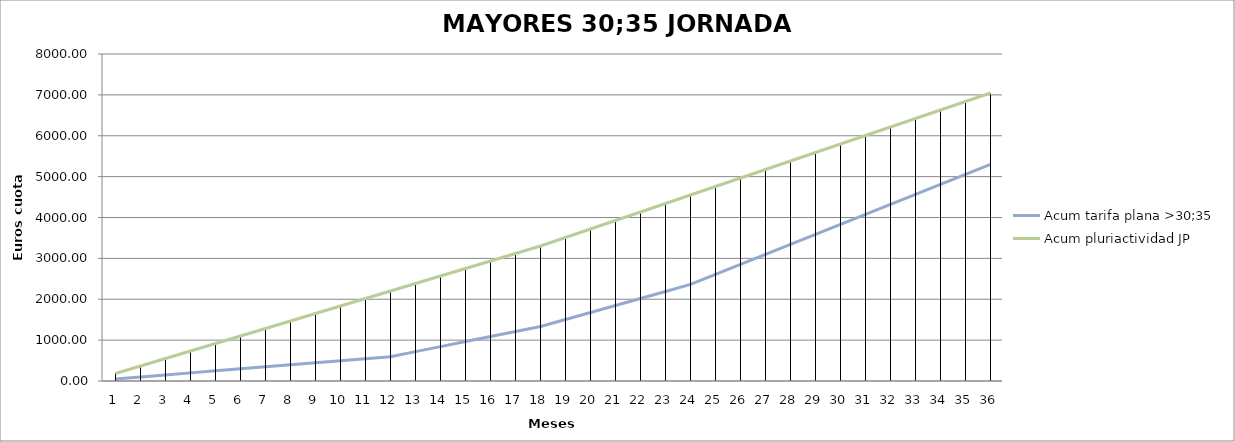
| Category | Acum tarifa plana >30;35 | Acum pluriactividad JP |
|---|---|---|
| 1.0 | 49.669 | 183.5 |
| 2.0 | 99.338 | 367 |
| 3.0 | 149.008 | 550.5 |
| 4.0 | 198.677 | 734 |
| 5.0 | 248.346 | 917.5 |
| 6.0 | 298.015 | 1101.001 |
| 7.0 | 347.684 | 1284.501 |
| 8.0 | 397.354 | 1468.001 |
| 9.0 | 447.023 | 1651.501 |
| 10.0 | 496.692 | 1835.001 |
| 11.0 | 546.361 | 2018.501 |
| 12.0 | 596.03 | 2202.001 |
| 13.0 | 718.824 | 2385.501 |
| 14.0 | 841.617 | 2569.001 |
| 15.0 | 964.41 | 2752.502 |
| 16.0 | 1087.204 | 2936.002 |
| 17.0 | 1209.997 | 3119.502 |
| 18.0 | 1332.79 | 3303.002 |
| 19.0 | 1504.333 | 3510.969 |
| 20.0 | 1675.876 | 3718.935 |
| 21.0 | 1847.418 | 3926.902 |
| 22.0 | 2018.961 | 4134.869 |
| 23.0 | 2190.504 | 4342.836 |
| 24.0 | 2362.046 | 4550.802 |
| 25.0 | 2606.713 | 4758.769 |
| 26.0 | 2851.38 | 4966.736 |
| 27.0 | 3096.047 | 5174.703 |
| 28.0 | 3340.714 | 5382.67 |
| 29.0 | 3585.38 | 5590.636 |
| 30.0 | 3830.047 | 5798.603 |
| 31.0 | 4074.714 | 6006.57 |
| 32.0 | 4319.381 | 6214.537 |
| 33.0 | 4564.048 | 6422.503 |
| 34.0 | 4808.714 | 6630.47 |
| 35.0 | 5053.381 | 6838.437 |
| 36.0 | 5298.048 | 7046.404 |